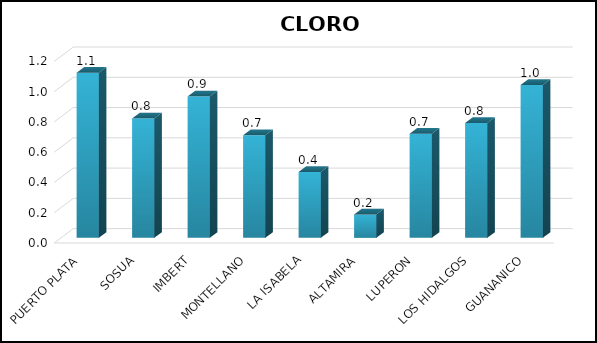
| Category | Series 0 |
|---|---|
| PUERTO PLATA | 1.092 |
| SOSUA | 0.789 |
| IMBERT | 0.934 |
| MONTELLANO | 0.678 |
| LA ISABELA | 0.436 |
| ALTAMIRA | 0.154 |
| LUPERON | 0.688 |
| LOS HIDALGOS | 0.758 |
| GUANANICO | 1.01 |